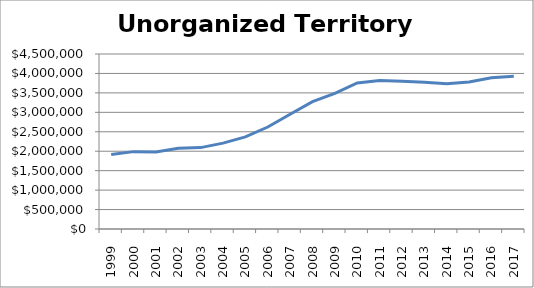
| Category | Unorganized Territory (000s) |
|---|---|
| 1999.0 | 1916300 |
| 2000.0 | 1989450 |
| 2001.0 | 1977650 |
| 2002.0 | 2078950 |
| 2003.0 | 2092650 |
| 2004.0 | 2208300 |
| 2005.0 | 2367600 |
| 2006.0 | 2622200 |
| 2007.0 | 2951250 |
| 2008.0 | 3274400 |
| 2009.0 | 3485550 |
| 2010.0 | 3756650 |
| 2011.0 | 3815400 |
| 2012.0 | 3798650 |
| 2013.0 | 3775800 |
| 2014.0 | 3735850 |
| 2015.0 | 3778750 |
| 2016.0 | 3887100 |
| 2017.0 | 3925550 |